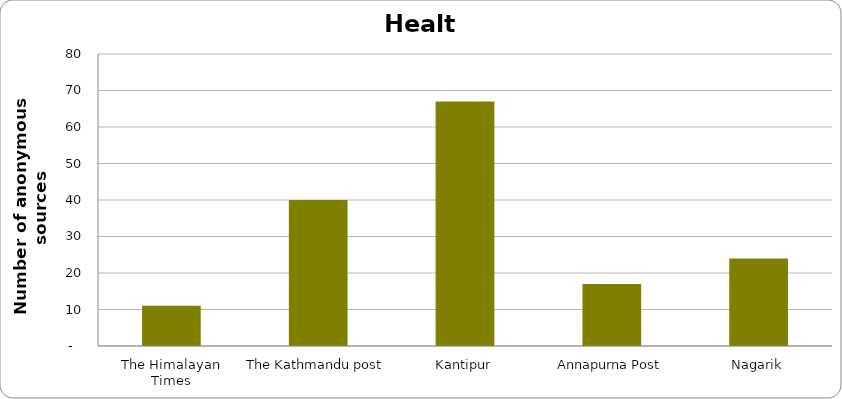
| Category | Health |
|---|---|
| The Himalayan Times | 11 |
| The Kathmandu post | 40 |
| Kantipur | 67 |
| Annapurna Post | 17 |
| Nagarik | 24 |